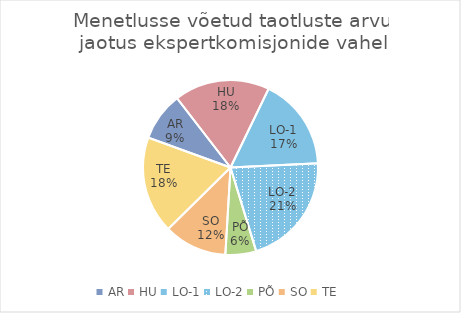
| Category | Series 0 |
|---|---|
| AR | 0.09 |
| HU | 0.176 |
| LO-1 | 0.17 |
| LO-2 | 0.21 |
| PÕ | 0.057 |
| SO | 0.116 |
| TE | 0.179 |